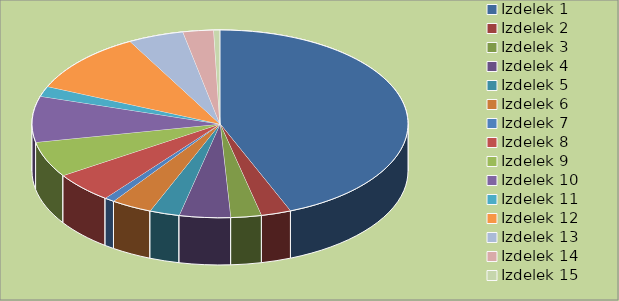
| Category | Series 0 |
|---|---|
| Izdelek 1 | 5000 |
| Izdelek 2 | 294 |
| Izdelek 3 | 300 |
| Izdelek 4 | 500 |
| Izdelek 5 | 294 |
| Izdelek 6 | 400 |
| Izdelek 7 | 100 |
| Izdelek 8 | 600 |
| Izdelek 9 | 700 |
| Izdelek 10 | 900 |
| Izdelek 11 | 200 |
| Izdelek 12 | 1200 |
| Izdelek 13 | 544 |
| Izdelek 14 | 300 |
| Izdelek 15 | 60 |